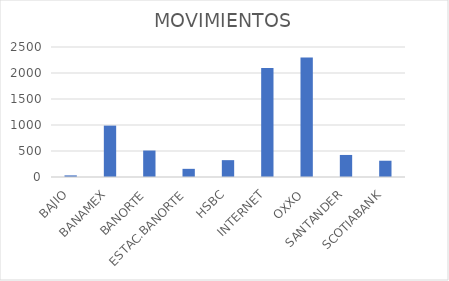
| Category | MOVIMIENTOS |
|---|---|
| BAJIO | 31 |
| BANAMEX | 988 |
| BANORTE | 509 |
| ESTAC.BANORTE | 157 |
| HSBC | 324 |
| INTERNET | 2095 |
| OXXO | 2300 |
| SANTANDER | 424 |
| SCOTIABANK | 313 |